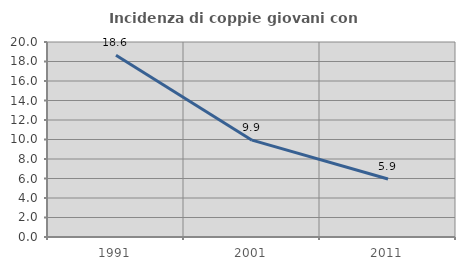
| Category | Incidenza di coppie giovani con figli |
|---|---|
| 1991.0 | 18.648 |
| 2001.0 | 9.932 |
| 2011.0 | 5.946 |